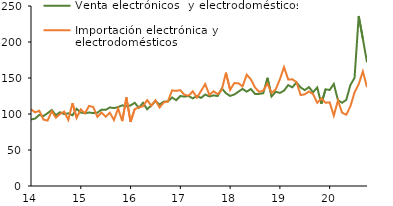
| Category | Venta electrónicos  y electrodomésticos | Importación electrónica y electrodomésticos |
|---|---|---|
| 2014-01-01 | 92.36 | 106.641 |
| 2014-02-01 | 93.626 | 102.278 |
| 2014-03-01 | 98.692 | 104.505 |
| 2014-04-01 | 97.195 | 92.234 |
| 2014-05-01 | 101.122 | 90.83 |
| 2014-06-01 | 105.622 | 103.827 |
| 2014-07-01 | 98.295 | 94.862 |
| 2014-08-01 | 102.453 | 99.929 |
| 2014-09-01 | 99.86 | 103.354 |
| 2014-10-01 | 100.924 | 91.873 |
| 2014-11-01 | 98.19 | 115.067 |
| 2014-12-01 | 107.254 | 94.599 |
| 2015-01-01 | 102.065 | 106.395 |
| 2015-02-01 | 101.03 | 101.076 |
| 2015-03-01 | 102.111 | 111.235 |
| 2015-04-01 | 101.263 | 109.67 |
| 2015-05-01 | 101.794 | 96.111 |
| 2015-06-01 | 106.096 | 101.941 |
| 2015-07-01 | 105.733 | 96.22 |
| 2015-08-01 | 109.095 | 101.654 |
| 2015-09-01 | 108.264 | 91.629 |
| 2015-10-01 | 109.572 | 107.795 |
| 2015-11-01 | 112.077 | 90.086 |
| 2015-12-01 | 110.721 | 123.012 |
| 2016-01-01 | 111.879 | 88.944 |
| 2016-02-01 | 115.571 | 106.799 |
| 2016-03-01 | 108.674 | 109.132 |
| 2016-04-01 | 115.54 | 110.712 |
| 2016-05-01 | 106.608 | 119.309 |
| 2016-06-01 | 111.813 | 111.495 |
| 2016-07-01 | 117.929 | 119.053 |
| 2016-08-01 | 113.169 | 109.067 |
| 2016-09-01 | 117.158 | 116.031 |
| 2016-10-01 | 117.256 | 117.452 |
| 2016-11-01 | 122.986 | 132.715 |
| 2016-12-01 | 119.172 | 132.135 |
| 2017-01-01 | 124.904 | 133.059 |
| 2017-02-01 | 124.238 | 126.661 |
| 2017-03-01 | 124.922 | 125.481 |
| 2017-04-01 | 121.673 | 131.524 |
| 2017-05-01 | 125.016 | 122.698 |
| 2017-06-01 | 122.331 | 132.073 |
| 2017-07-01 | 127.035 | 141.574 |
| 2017-08-01 | 124.325 | 126.472 |
| 2017-09-01 | 125.883 | 131.52 |
| 2017-10-01 | 124.939 | 127.529 |
| 2017-11-01 | 135.459 | 133.747 |
| 2017-12-01 | 128.848 | 157.453 |
| 2018-01-01 | 125.123 | 133.448 |
| 2018-02-01 | 127.055 | 142.911 |
| 2018-03-01 | 130.961 | 142.704 |
| 2018-04-01 | 134.796 | 138.331 |
| 2018-05-01 | 130.998 | 154.582 |
| 2018-06-01 | 134.709 | 148.098 |
| 2018-07-01 | 127.942 | 136.798 |
| 2018-08-01 | 127.934 | 130.764 |
| 2018-09-01 | 128.9 | 132.618 |
| 2018-10-01 | 150.297 | 142.25 |
| 2018-11-01 | 124.4 | 129.254 |
| 2018-12-01 | 130.951 | 134.242 |
| 2019-01-01 | 129.238 | 148.15 |
| 2019-02-01 | 132.456 | 165.193 |
| 2019-03-01 | 140.142 | 148.026 |
| 2019-04-01 | 137.048 | 148.109 |
| 2019-05-01 | 143.748 | 144.383 |
| 2019-06-01 | 136.834 | 126.287 |
| 2019-07-01 | 133.181 | 127.316 |
| 2019-08-01 | 137.304 | 131.296 |
| 2019-09-01 | 130.183 | 127.668 |
| 2019-10-01 | 136.867 | 115.533 |
| 2019-11-01 | 113.985 | 121.579 |
| 2019-12-01 | 134.312 | 115.653 |
| 2020-01-01 | 133.33 | 116.161 |
| 2020-02-01 | 141.701 | 97.686 |
| 2020-03-01 | 119.128 | 118.88 |
| 2020-04-01 | 115.558 | 101.814 |
| 2020-05-01 | 119.597 | 99.018 |
| 2020-06-01 | 140.255 | 110.722 |
| 2020-07-01 | 150.226 | 130.114 |
| 2020-08-01 | 236.082 | 141.417 |
| 2020-09-01 | 204.54 | 159.151 |
| 2020-10-01 | 171.716 | 137.262 |